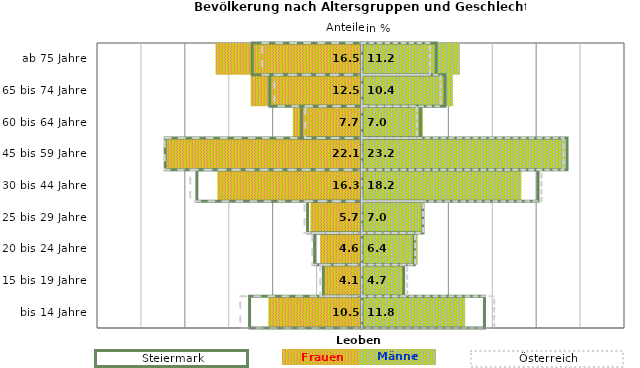
| Category | Frauen | Männer | Frauen Spalte2 | Männer Spalte2 | Frauen Spalte3 | Männer Spalte3 |
|---|---|---|---|---|---|---|
| bis 14 Jahre | -10.5 | 11.8 | 14 | -12.8 | -13.8 | 15.1 |
| 15 bis 19 Jahre | -4.1 | 4.7 | 4.8 | -4.4 | -4.7 | 5.2 |
| 20 bis 24 Jahre | -4.6 | 6.4 | 6 | -5.4 | -5.6 | 6.1 |
| 25 bis 29 Jahre | -5.7 | 7 | 7 | -6.2 | -6.5 | 7 |
| 30 bis 44 Jahre | -16.3 | 18.2 | 20.1 | -18.8 | -19.5 | 20.5 |
| 45 bis 59 Jahre | -22.1 | 23.2 | 23.4 | -22.4 | -22.4 | 23 |
| 60 bis 64 Jahre | -7.7 | 7 | 6.7 | -6.9 | -6.4 | 6.3 |
| 65 bis 74 Jahre | -12.5 | 10.4 | 9.5 | -10.5 | -9.9 | 9 |
| ab 75 Jahre | -16.5 | 11.2 | 8.5 | -12.5 | -11.3 | 7.8 |